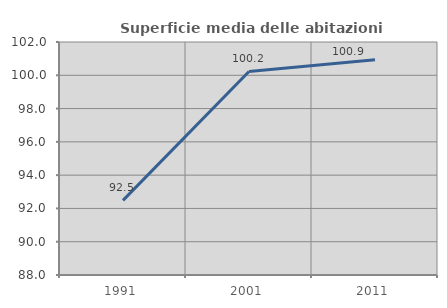
| Category | Superficie media delle abitazioni occupate |
|---|---|
| 1991.0 | 92.485 |
| 2001.0 | 100.228 |
| 2011.0 | 100.934 |